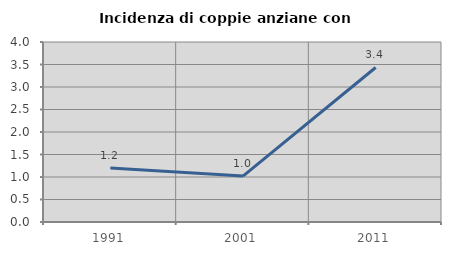
| Category | Incidenza di coppie anziane con figli |
|---|---|
| 1991.0 | 1.198 |
| 2001.0 | 1.02 |
| 2011.0 | 3.433 |